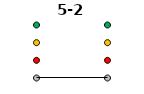
| Category | 0 | 1 | 2 | 3 | 5-2 |
|---|---|---|---|---|---|
| Time 1 | 0 | 1 | 2 | 3 | 0 |
| Time 2 | 0 | 1 | 2 | 3 | 0 |